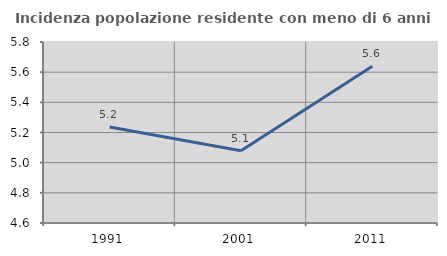
| Category | Incidenza popolazione residente con meno di 6 anni |
|---|---|
| 1991.0 | 5.237 |
| 2001.0 | 5.079 |
| 2011.0 | 5.639 |